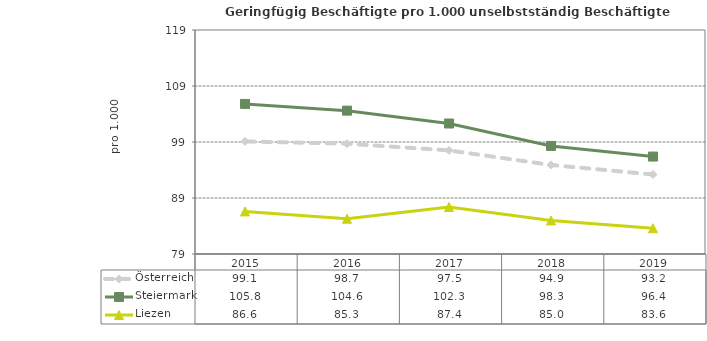
| Category | Österreich | Steiermark | Liezen |
|---|---|---|---|
| 2019.0 | 93.2 | 96.4 | 83.6 |
| 2018.0 | 94.9 | 98.3 | 85 |
| 2017.0 | 97.5 | 102.3 | 87.4 |
| 2016.0 | 98.7 | 104.6 | 85.3 |
| 2015.0 | 99.1 | 105.8 | 86.6 |